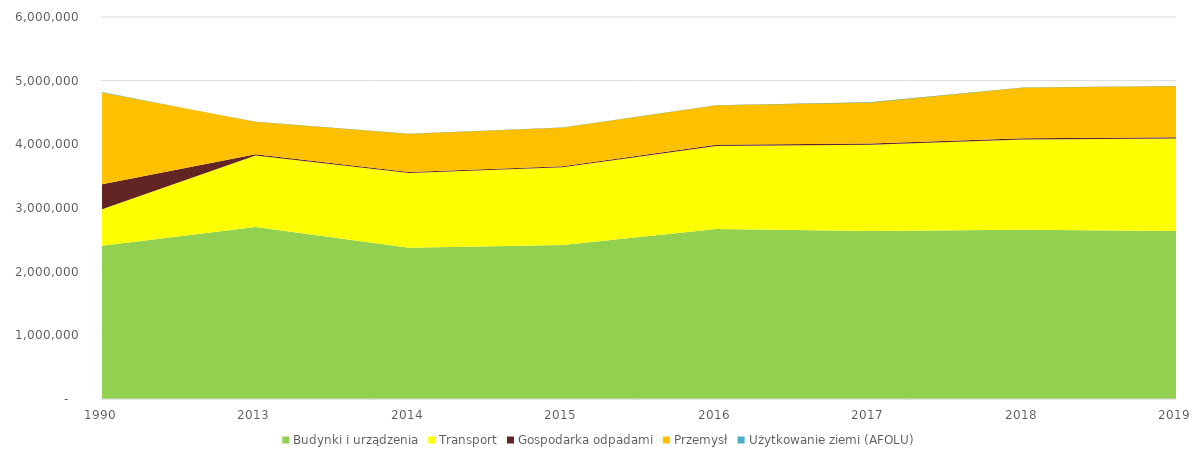
| Category | Budynki i urządzenia | Transport | Gospodarka odpadami | Przemysł | Użytkowanie ziemi (AFOLU) |
|---|---|---|---|---|---|
| 1990.0 | 2406952 | 574255 | 390686 | 1442928 | 9064 |
| 2013.0 | 2703370 | 1122183 | 16741 | 513222 | -3978 |
| 2014.0 | 2373745 | 1176469 | 16483 | 599911 | -5028 |
| 2015.0 | 2417147 | 1221099 | 16937 | 610393 | -5139 |
| 2016.0 | 2669265 | 1305884 | 16467 | 623177 | -5024 |
| 2017.0 | 2639218 | 1356146 | 18332 | 646077 | -5031 |
| 2018.0 | 2657758 | 1419678 | 19662 | 796956 | -4448 |
| 2019.0 | 2640159 | 1450622 | 19757 | 806825 | -4444 |